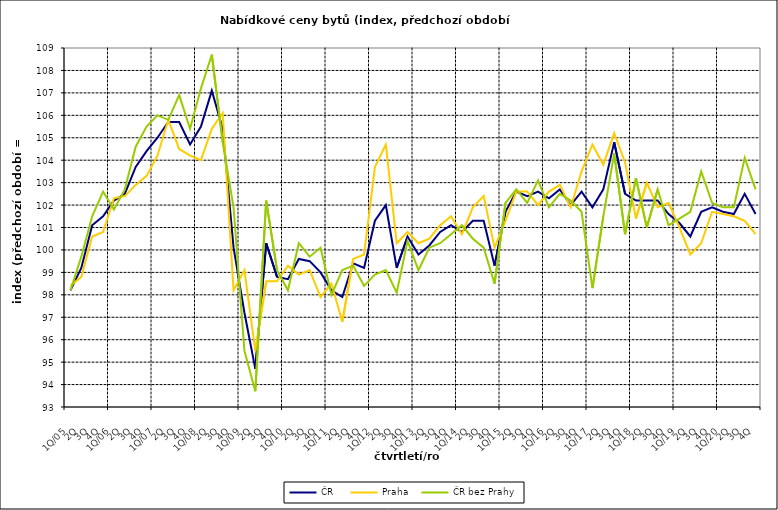
| Category | ČR  | Praha | ČR bez Prahy  |
|---|---|---|---|
| 1Q/05 | 98.2 | 98.4 | 98.2 |
| 2Q | 99.2 | 98.8 | 99.7 |
| 3Q | 101.1 | 100.6 | 101.5 |
| 4Q | 101.5 | 100.8 | 102.6 |
| 1Q/06 | 102.2 | 102.3 | 101.8 |
| 2Q | 102.5 | 102.4 | 102.7 |
| 3Q | 103.7 | 102.9 | 104.6 |
| 4Q | 104.4 | 103.3 | 105.5 |
| 1Q/07 | 105 | 104.2 | 106 |
| 2Q | 105.7 | 105.8 | 105.8 |
| 3Q | 105.7 | 104.5 | 106.9 |
| 4Q | 104.7 | 104.2 | 105.4 |
| 1Q/08 | 105.5 | 104 | 107.2 |
| 2Q | 107.1 | 105.4 | 108.7 |
| 3Q | 105.4 | 106.1 | 104.8 |
| 4Q | 100.1 | 98.2 | 101.9 |
| 1Q/09 | 97.2 | 99.1 | 95.5 |
| 2Q | 94.7 | 95.5 | 93.7 |
| 3Q | 100.3 | 98.6 | 102.2 |
| 4Q | 98.8 | 98.6 | 99.1 |
| 1Q/10 | 98.7 | 99.3 | 98.2 |
| 2Q | 99.6 | 98.9 | 100.3 |
| 3Q | 99.5 | 99.1 | 99.7 |
| 4Q | 99 | 97.9 | 100.1 |
| 1Q/11 | 98.2 | 98.5 | 98 |
| 2Q | 97.9 | 96.8 | 99.1 |
| 3Q | 99.4 | 99.6 | 99.3 |
| 4Q | 99.2 | 99.8 | 98.4 |
| 1Q/12 | 101.3 | 103.7 | 98.9 |
| 2Q | 102 | 104.7 | 99.1 |
| 3Q | 99.2 | 100.3 | 98.1 |
| 4Q | 100.6 | 100.8 | 100.4 |
| 1Q/13 | 99.8 | 100.3 | 99.1 |
| 2Q | 100.2 | 100.5 | 100.1 |
| 3Q | 100.8 | 101.1 | 100.3 |
| 4Q | 101.1 | 101.5 | 100.7 |
| 1Q/14 | 100.8 | 100.7 | 101.1 |
| 2Q | 101.3 | 101.9 | 100.5 |
| 3Q | 101.3 | 102.4 | 100.1 |
| 4Q | 99.3 | 100.1 | 98.5 |
| 1Q/15 | 101.7 | 101.3 | 102.1 |
| 2Q | 102.6 | 102.6 | 102.7 |
| 3Q | 102.4 | 102.6 | 102.1 |
| 4Q | 102.6 | 102 | 103.1 |
| 1Q/16 | 102.3 | 102.6 | 101.9 |
| 2Q | 102.7 | 102.9 | 102.5 |
| 3Q | 102 | 101.9 | 102.2 |
| 4Q | 102.6 | 103.5 | 101.7 |
| 1Q/17 | 101.9 | 104.7 | 98.3 |
| 2Q | 102.7 | 103.8 | 101.5 |
| 3Q | 104.8 | 105.2 | 104.3 |
| 4Q | 102.5 | 103.9 | 100.7 |
| 1Q/18 | 102.2 | 101.4 | 103.2 |
| 2Q | 102.2 | 103 | 101 |
| 3Q | 102.2 | 101.9 | 102.7 |
| 4Q | 101.6 | 102.1 | 101.1 |
| 1Q/19 | 101.2 | 101 | 101.4 |
| 2Q | 100.6 | 99.8 | 101.7 |
| 3Q | 101.7 | 100.3 | 103.5 |
| 4Q | 101.9 | 101.7 | 102.1 |
| 1Q/20 | 101.7 | 101.6 | 101.9 |
| 2Q | 101.6 | 101.5 | 101.9 |
| 3Q | 102.5 | 101.3 | 104.1 |
| 4Q | 101.6 | 100.7 | 102.7 |